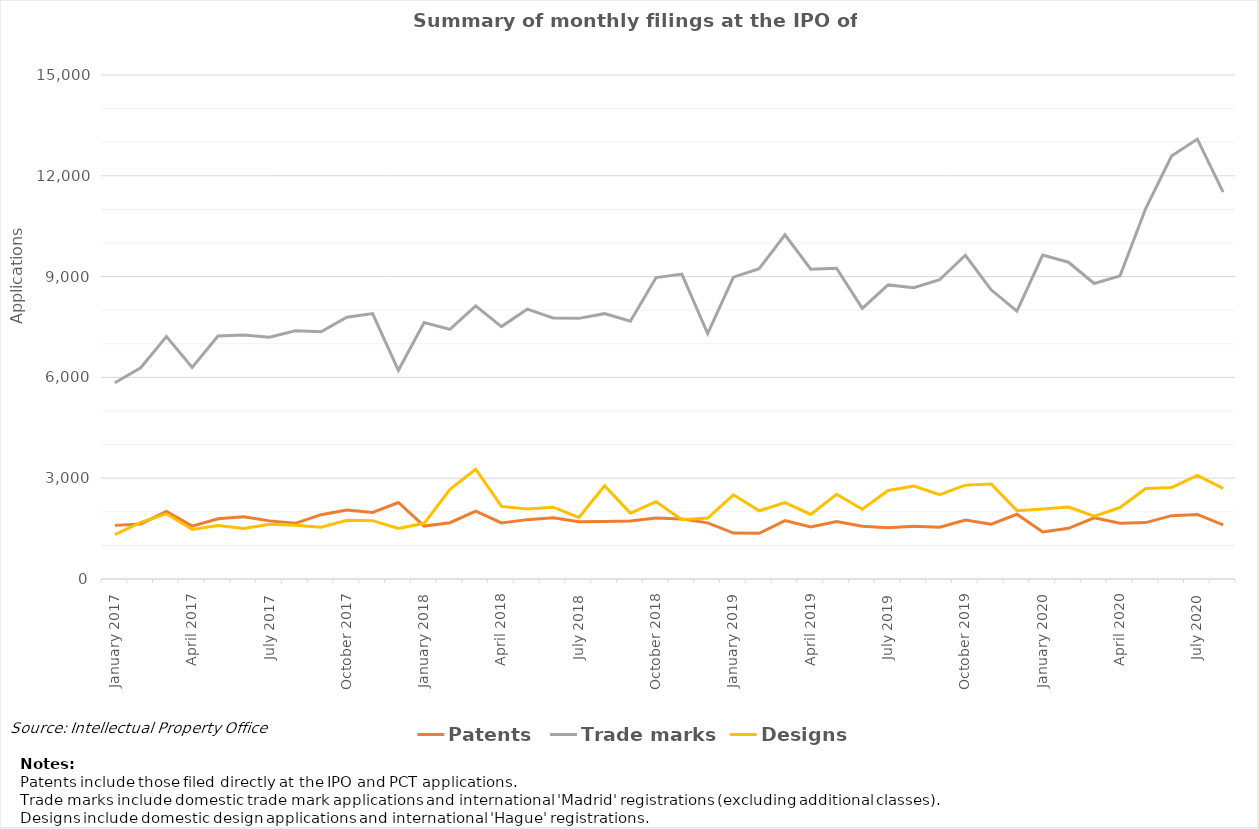
| Category | Patents | Trade marks | Designs |
|---|---|---|---|
| January 2017 | 1596 | 5843 | 1318 |
| February 2017 | 1640 | 6288 | 1687 |
| March 2017 | 2011 | 7214 | 1940 |
| April 2017 | 1573 | 6297 | 1474 |
| May 2017 | 1790 | 7234 | 1592 |
| June 2017 | 1853 | 7263 | 1502 |
| July 2017 | 1730 | 7197 | 1627 |
| August 2017 | 1657 | 7389 | 1600 |
| September 2017 | 1915 | 7359 | 1544 |
| October 2017 | 2055 | 7792 | 1745 |
| November 2017 | 1983 | 7901 | 1736 |
| December 2017 | 2277 | 6211 | 1507 |
| January 2018 | 1575 | 7634 | 1658 |
| February 2018 | 1676 | 7428 | 2672 |
| March 2018 | 2022 | 8127 | 3267 |
| April 2018 | 1670 | 7512 | 2160 |
| May 2018 | 1767 | 8030 | 2083 |
| June 2018 | 1821 | 7769 | 2136 |
| July 2018 | 1704 | 7757 | 1832 |
| August 2018 | 1713 | 7897 | 2777 |
| September 2018 | 1725 | 7673 | 1960 |
| October 2018 | 1818 | 8972 | 2302 |
| November 2018 | 1787 | 9076 | 1765 |
| December 2018 | 1670 | 7304 | 1815 |
| January 2019 | 1367 | 8983 | 2505 |
| February 2019 | 1361 | 9234 | 2031 |
| March 2019 | 1737 | 10244 | 2275 |
| April 2019 | 1552 | 9219 | 1923 |
| May 2019 | 1710 | 9251 | 2520 |
| June 2019 | 1570 | 8053 | 2074 |
| July 2019 | 1527 | 8752 | 2634 |
| August 2019 | 1572 | 8670 | 2768 |
| September 2019 | 1540 | 8907 | 2511 |
| October 2019 | 1755 | 9636 | 2794 |
| November 2019 | 1629 | 8607 | 2827 |
| December 2019 | 1927 | 7970 | 2034 |
| January 2020 | 1400 | 9642 | 2082 |
| February 2020 | 1509 | 9428 | 2143 |
| March 2020 | 1820 | 8794 | 1871 |
| April 2020 | 1658 | 9021 | 2127 |
| May 2020 | 1678 | 11034 | 2694 |
| June 2020 | 1886 | 12590 | 2721 |
| July 2020 | 1921 | 13092 | 3086 |
| August 2020 | 1614 | 11515 | 2695 |